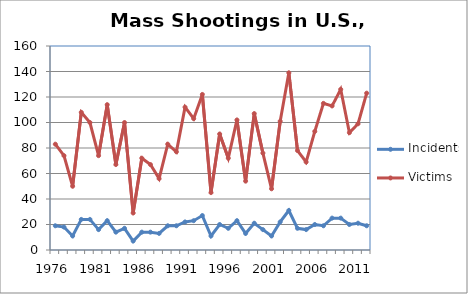
| Category | Incidents | Victims |
|---|---|---|
| 1976.0 | 19 | 83 |
| 1977.0 | 18 | 74 |
| 1978.0 | 11 | 50 |
| 1979.0 | 24 | 108 |
| 1980.0 | 24 | 100 |
| 1981.0 | 16 | 74 |
| 1982.0 | 23 | 114 |
| 1983.0 | 14 | 67 |
| 1984.0 | 17 | 100 |
| 1985.0 | 7 | 29 |
| 1986.0 | 14 | 72 |
| 1987.0 | 14 | 67 |
| 1988.0 | 13 | 56 |
| 1989.0 | 19 | 83 |
| 1990.0 | 19 | 77 |
| 1991.0 | 22 | 112 |
| 1992.0 | 23 | 103 |
| 1993.0 | 27 | 122 |
| 1994.0 | 11 | 45 |
| 1995.0 | 20 | 91 |
| 1996.0 | 17 | 72 |
| 1997.0 | 23 | 102 |
| 1998.0 | 13 | 54 |
| 1999.0 | 21 | 107 |
| 2000.0 | 16 | 76 |
| 2001.0 | 11 | 48 |
| 2002.0 | 22 | 101 |
| 2003.0 | 31 | 139 |
| 2004.0 | 17 | 78 |
| 2005.0 | 16 | 69 |
| 2006.0 | 20 | 93 |
| 2007.0 | 19 | 115 |
| 2008.0 | 25 | 113 |
| 2009.0 | 25 | 126 |
| 2010.0 | 20 | 92 |
| 2011.0 | 21 | 99 |
| 2012.0 | 19 | 123 |